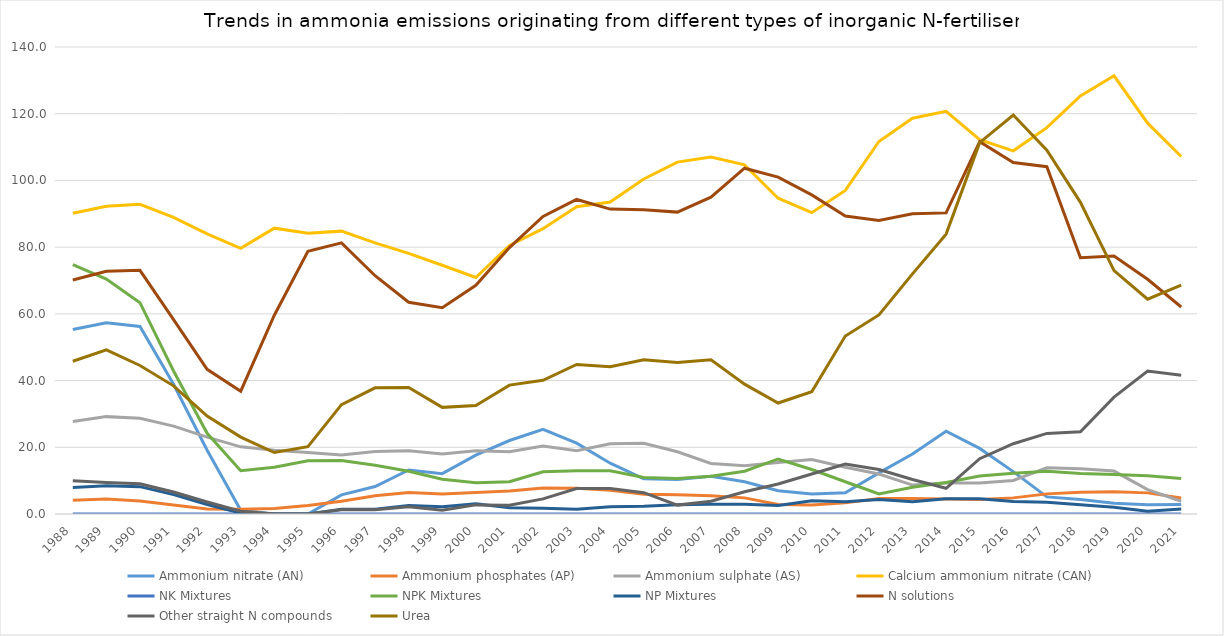
| Category | Ammonium nitrate (AN) | Ammonium phosphates (AP) | Ammonium sulphate (AS) | Calcium ammonium nitrate (CAN) | NK Mixtures | NPK Mixtures | NP Mixtures | N solutions | Other straight N compounds | Urea |
|---|---|---|---|---|---|---|---|---|---|---|
| 1988.0 | 55.32 | 4.14 | 27.72 | 90.18 | 0 | 74.76 | 7.98 | 70.14 | 9.96 | 45.78 |
| 1989.0 | 57.33 | 4.53 | 29.19 | 92.25 | 0 | 70.44 | 8.46 | 72.75 | 9.45 | 49.23 |
| 1990.0 | 56.22 | 3.92 | 28.68 | 92.84 | 0 | 63.36 | 8.2 | 73.04 | 9.06 | 44.52 |
| 1991.0 | 38.88 | 2.68 | 26.34 | 88.9 | 0 | 42.86 | 5.82 | 58.26 | 6.58 | 38.42 |
| 1992.0 | 19.1 | 1.48 | 23.06 | 83.98 | 0 | 24.2 | 2.84 | 43.36 | 3.6 | 29.36 |
| 1993.0 | 1.1 | 1.4 | 20.14 | 79.64 | 0 | 13 | 0.28 | 36.82 | 0.84 | 23.06 |
| 1994.0 | 0 | 1.66 | 19.14 | 85.687 | 0 | 14.013 | 0 | 59.587 | 0 | 18.433 |
| 1995.0 | 0 | 2.553 | 18.467 | 84.167 | 0 | 15.967 | 0 | 78.767 | 0 | 20.167 |
| 1996.0 | 5.733 | 3.833 | 17.667 | 84.8 | 0 | 16.033 | 1.4 | 81.267 | 1.267 | 32.8 |
| 1997.0 | 8.233 | 5.5 | 18.7 | 81.3 | 0 | 14.633 | 1.4 | 71.433 | 1.267 | 37.833 |
| 1998.0 | 13.2 | 6.467 | 18.967 | 78.133 | 0 | 12.8 | 2.533 | 63.467 | 2.2 | 37.9 |
| 1999.0 | 12.1 | 6 | 17.967 | 74.567 | 0 | 10.4 | 2.167 | 61.833 | 1.1 | 31.967 |
| 2000.0 | 17.667 | 6.467 | 18.933 | 70.9 | 0 | 9.367 | 3.033 | 68.567 | 2.733 | 32.5 |
| 2001.0 | 22.033 | 6.9 | 18.667 | 80.5 | 0 | 9.667 | 1.9 | 79.867 | 2.6 | 38.633 |
| 2002.0 | 25.4 | 7.8 | 20.367 | 85.533 | 0 | 12.633 | 1.733 | 89.2 | 4.533 | 40.067 |
| 2003.0 | 21.233 | 7.7 | 19 | 92.133 | 0 | 12.933 | 1.4 | 94.3 | 7.633 | 44.833 |
| 2004.0 | 15.233 | 7.1 | 21.067 | 93.533 | 0 | 12.967 | 2.167 | 91.4 | 7.667 | 44.133 |
| 2005.0 | 10.567 | 5.9 | 21.2 | 100.433 | 0 | 10.967 | 2.3 | 91.2 | 6.4 | 46.267 |
| 2006.0 | 10.333 | 5.8 | 18.667 | 105.5 | 0 | 10.667 | 2.767 | 90.5 | 2.667 | 45.4 |
| 2007.0 | 11.333 | 5.5 | 15.133 | 107 | 0 | 11.333 | 2.9 | 95 | 3.833 | 46.267 |
| 2008.0 | 9.667 | 4.833 | 14.467 | 104.667 | 0 | 12.833 | 2.9 | 103.667 | 6.667 | 38.933 |
| 2009.0 | 7 | 2.833 | 15.467 | 94.667 | 0 | 16.5 | 2.567 | 101 | 9 | 33.267 |
| 2010.0 | 6 | 2.667 | 16.333 | 90.333 | 0 | 13.333 | 4 | 95.667 | 12 | 36.667 |
| 2011.0 | 6.333 | 3.333 | 14 | 97 | 0 | 9.667 | 3.667 | 89.333 | 15 | 53.333 |
| 2012.0 | 12.333 | 4.667 | 12 | 111.667 | 0 | 6 | 4.333 | 88 | 13.333 | 59.667 |
| 2013.0 | 18 | 4.667 | 8.667 | 118.667 | 0 | 8 | 3.667 | 90 | 10.333 | 72 |
| 2014.0 | 24.833 | 4.533 | 9.267 | 120.7 | 0 | 9.467 | 4.567 | 90.267 | 7.7 | 83.9 |
| 2015.0 | 19.667 | 4.367 | 9.3 | 112.2 | 0 | 11.4 | 4.567 | 111.633 | 16.567 | 111.333 |
| 2016.0 | 12.7 | 4.833 | 10.067 | 108.867 | 0 | 12.2 | 3.767 | 105.367 | 21.067 | 119.6 |
| 2017.0 | 5.133 | 6.033 | 13.867 | 115.833 | 0 | 12.833 | 3.533 | 104.133 | 24.167 | 109.067 |
| 2018.0 | 4.333 | 6.533 | 13.533 | 125.333 | 0.033 | 12.167 | 2.767 | 76.833 | 24.633 | 93.433 |
| 2019.0 | 3.233 | 6.7 | 12.867 | 131.367 | 0.033 | 11.833 | 2.033 | 77.367 | 35.033 | 72.967 |
| 2020.0 | 2.8 | 6.333 | 7.3 | 117.167 | 0.033 | 11.433 | 0.833 | 70.367 | 42.867 | 64.4 |
| 2021.0 | 2.838 | 4.772 | 3.817 | 107.171 | 0 | 10.66 | 1.479 | 62.063 | 41.588 | 68.585 |